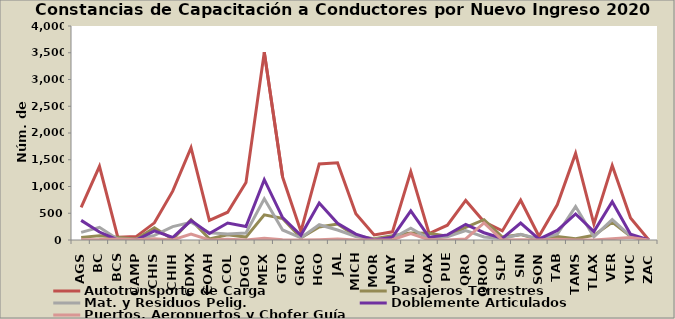
| Category | Autotransporte de Carga | Pasajeros Terrestres | Mat. y Residuos Pelig. | Doblemente Articulados | Puertos, Aeropuertos y Chofer Guía |
|---|---|---|---|---|---|
| AGS | 609 | 49 | 142 | 367 | 6 |
| BC | 1377 | 80 | 237 | 149 | 9 |
| BCS | 53 | 50 | 13 | 0 | 21 |
| CAMP | 64 | 14 | 13 | 0 | 4 |
| CHIS | 321 | 229 | 87 | 169 | 25 |
| CHIH | 913 | 11 | 251 | 47 | 2 |
| CDMX | 1725 | 378 | 331 | 364 | 113 |
| COAH | 366 | 21 | 134 | 122 | 0 |
| COL | 519 | 97 | 112 | 318 | 16 |
| DGO | 1073 | 54 | 132 | 253 | 0 |
| MEX | 3511 | 471 | 771 | 1127 | 33 |
| GTO | 1176 | 402 | 188 | 419 | 7 |
| GRO | 160 | 42 | 41 | 89 | 1 |
| HGO | 1421 | 244 | 286 | 692 | 7 |
| JAL | 1442 | 299 | 187 | 311 | 20 |
| MICH | 489 | 75 | 67 | 110 | 1 |
| MOR | 95 | 23 | 14 | 0 | 0 |
| NAY | 153 | 78 | 33 | 54 | 6 |
| NL | 1278 | 133 | 219 | 546 | 119 |
| OAX | 121 | 127 | 24 | 52 | 3 |
| PUE | 277 | 69 | 60 | 95 | 0 |
| QRO | 739 | 235 | 177 | 293 | 21 |
| QROO | 341 | 379 | 57 | 136 | 319 |
| SLP | 170 | 55 | 27 | 30 | 0 |
| SIN | 744 | 100 | 106 | 317 | 5 |
| SON | 70 | 10 | 20 | 16 | 0 |
| TAB | 658 | 65 | 110 | 179 | 14 |
| TAMS | 1618 | 24 | 625 | 486 | 2 |
| TLAX | 299 | 87 | 57 | 157 | 1 |
| VER | 1394 | 333 | 382 | 714 | 25 |
| YUC | 411 | 68 | 73 | 107 | 48 |
| ZAC | 0 | 0 | 0 | 0 | 0 |